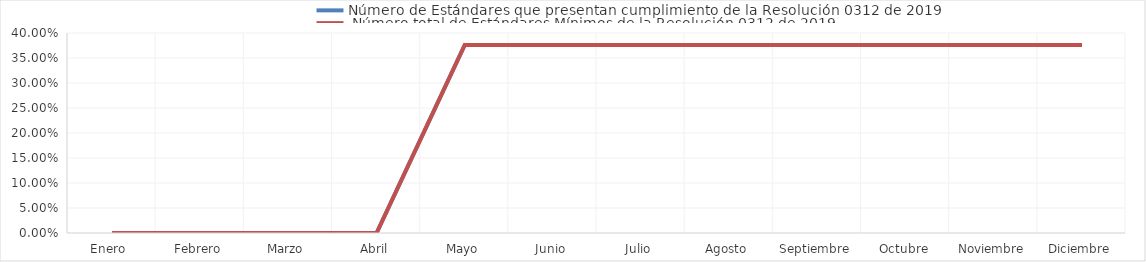
| Category | Número de Estándares que presentan cumplimiento de la Resolución 0312 de 2019 |  Número total de Estándares Mínimos de la Resolución 0312 de 2019 |
|---|---|---|
| Enero  | 0 | 0 |
| Febrero | 0 | 0 |
| Marzo | 0 | 0 |
| Abril | 0 | 0 |
| Mayo | 0.376 | 0.376 |
| Junio | 0.376 | 0.376 |
| Julio | 0.376 | 0.376 |
| Agosto | 0.376 | 0.376 |
| Septiembre | 0.376 | 0.376 |
| Octubre | 0.376 | 0.376 |
| Noviembre | 0.376 | 0.376 |
| Diciembre | 0.376 | 0.376 |